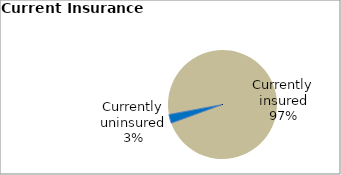
| Category | Series 0 |
|---|---|
| Currently uninsured | 2.614 |
| Currently insured | 97.386 |